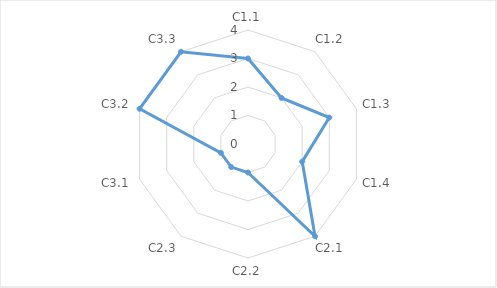
| Category | Series 0 |
|---|---|
| C1.1 | 3 |
| C1.2 | 2 |
| C1.3 | 3 |
| C1.4 | 2 |
| C2.1 | 4 |
| C2.2 | 1 |
| C2.3 | 1 |
| C3.1 | 1 |
| C3.2 | 4 |
| C3.3 | 4 |